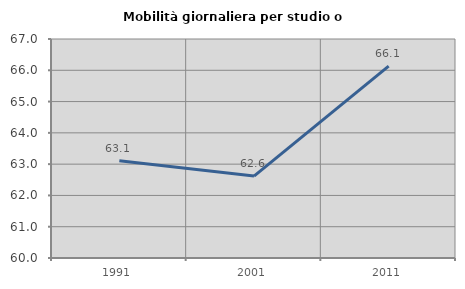
| Category | Mobilità giornaliera per studio o lavoro |
|---|---|
| 1991.0 | 63.111 |
| 2001.0 | 62.618 |
| 2011.0 | 66.135 |